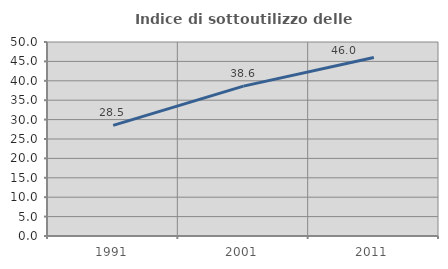
| Category | Indice di sottoutilizzo delle abitazioni  |
|---|---|
| 1991.0 | 28.52 |
| 2001.0 | 38.629 |
| 2011.0 | 46.02 |